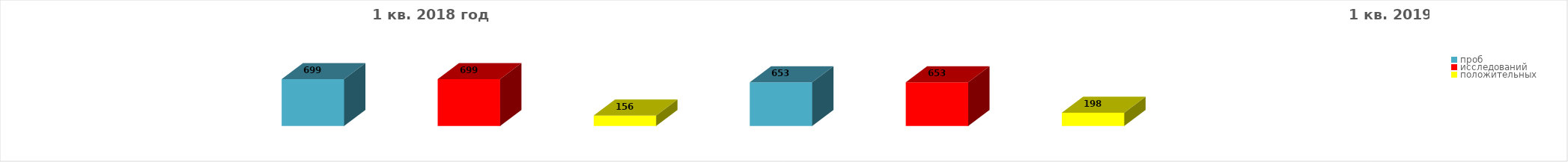
| Category | Series 4 |
|---|---|
| проб | 699 |
| исследований | 699 |
| положительных | 156 |
| проб | 653 |
| исследований | 653 |
| положительных | 198 |